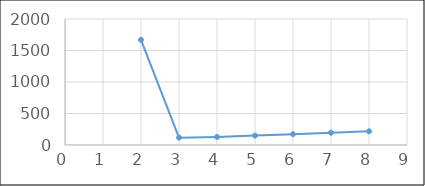
| Category | Series 0 |
|---|---|
| 2.0 | 1669.455 |
| 3.0 | 116.974 |
| 4.0 | 128.457 |
| 5.0 | 149.286 |
| 6.0 | 171.79 |
| 7.0 | 194.676 |
| 8.0 | 217.652 |